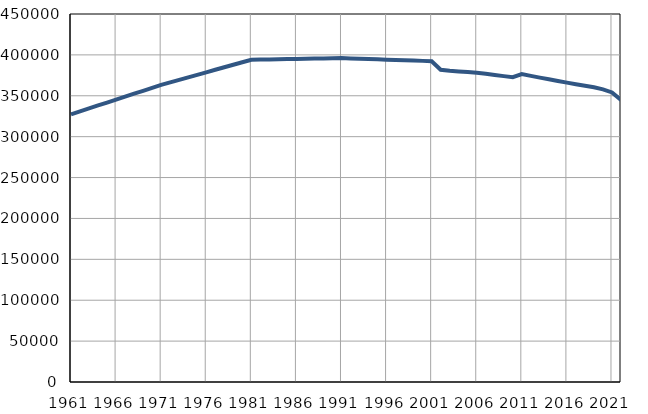
| Category | Population
size |
|---|---|
| 1961.0 | 327367 |
| 1962.0 | 330960 |
| 1963.0 | 334552 |
| 1964.0 | 338145 |
| 1965.0 | 341737 |
| 1966.0 | 345330 |
| 1967.0 | 348922 |
| 1968.0 | 352515 |
| 1969.0 | 356107 |
| 1970.0 | 359700 |
| 1971.0 | 363292 |
| 1972.0 | 366374 |
| 1973.0 | 369456 |
| 1974.0 | 372537 |
| 1975.0 | 375619 |
| 1976.0 | 378701 |
| 1977.0 | 381783 |
| 1978.0 | 384865 |
| 1979.0 | 387946 |
| 1980.0 | 391028 |
| 1981.0 | 394110 |
| 1982.0 | 394303 |
| 1983.0 | 394497 |
| 1984.0 | 394690 |
| 1985.0 | 394883 |
| 1986.0 | 395077 |
| 1987.0 | 395270 |
| 1988.0 | 395463 |
| 1989.0 | 395656 |
| 1990.0 | 395850 |
| 1991.0 | 396043 |
| 1992.0 | 395669 |
| 1993.0 | 395296 |
| 1994.0 | 394922 |
| 1995.0 | 394548 |
| 1996.0 | 394174 |
| 1997.0 | 393801 |
| 1998.0 | 393427 |
| 1999.0 | 393053 |
| 2000.0 | 392679 |
| 2001.0 | 392306 |
| 2002.0 | 381801 |
| 2003.0 | 380579 |
| 2004.0 | 379829 |
| 2005.0 | 379076 |
| 2006.0 | 378059 |
| 2007.0 | 376946 |
| 2008.0 | 375453 |
| 2009.0 | 374017 |
| 2010.0 | 372670 |
| 2011.0 | 376522 |
| 2012.0 | 374371 |
| 2013.0 | 372220 |
| 2014.0 | 370215 |
| 2015.0 | 368088 |
| 2016.0 | 366056 |
| 2017.0 | 364157 |
| 2018.0 | 362331 |
| 2019.0 | 360494 |
| 2020.0 | 357920 |
| 2021.0 | 354102 |
| 2022.0 | 344877 |